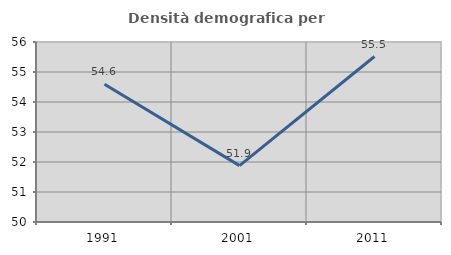
| Category | Densità demografica |
|---|---|
| 1991.0 | 54.592 |
| 2001.0 | 51.88 |
| 2011.0 | 55.516 |